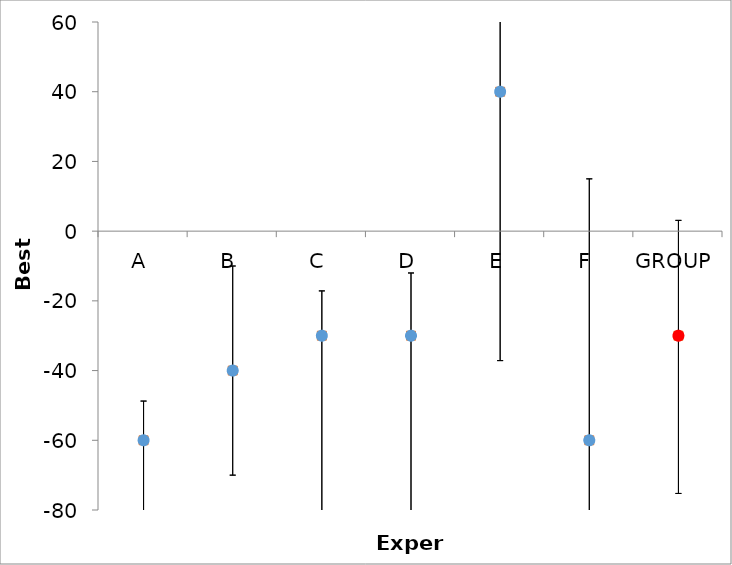
| Category | Series 1 | Series 0 |
|---|---|---|
| A | -60 | -60 |
| B | -40 | -40 |
| C | -30 | -30 |
| D | -30 | -30 |
| E | 40 | 40 |
| F | -60 | -60 |
| GROUP | -30 | -30 |